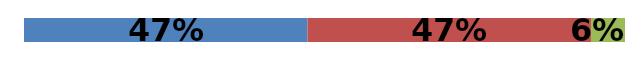
| Category | Series 0 | Series 1 | Series 2 |
|---|---|---|---|
| 0 | 0.472 | 0.472 | 0.057 |